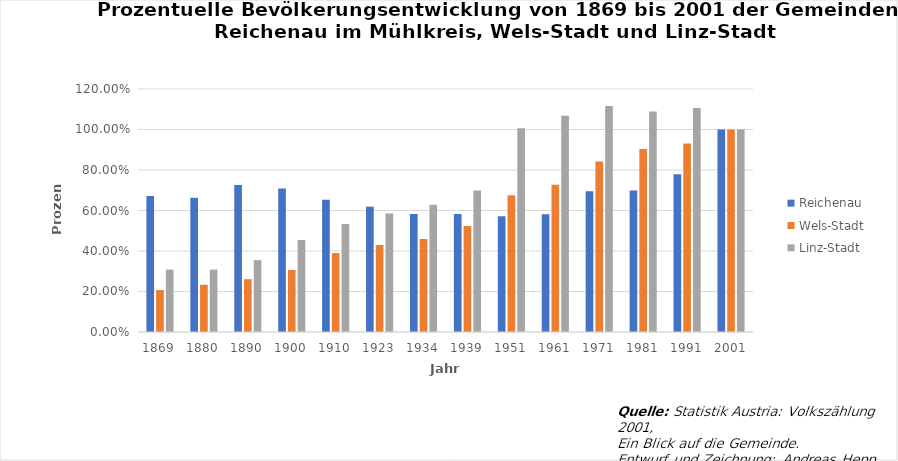
| Category | Reichenau | Wels-Stadt | Linz-Stadt |
|---|---|---|---|
| 1869.0 | 0.672 | 0.207 | 0.308 |
| 1880.0 | 0.663 | 0.233 | 0.308 |
| 1890.0 | 0.726 | 0.261 | 0.355 |
| 1900.0 | 0.709 | 0.306 | 0.454 |
| 1910.0 | 0.653 | 0.39 | 0.533 |
| 1923.0 | 0.619 | 0.429 | 0.586 |
| 1934.0 | 0.583 | 0.46 | 0.629 |
| 1939.0 | 0.583 | 0.523 | 0.698 |
| 1951.0 | 0.572 | 0.675 | 1.006 |
| 1961.0 | 0.582 | 0.727 | 1.068 |
| 1971.0 | 0.695 | 0.842 | 1.117 |
| 1981.0 | 0.699 | 0.904 | 1.089 |
| 1991.0 | 0.779 | 0.931 | 1.106 |
| 2001.0 | 1 | 1 | 1 |